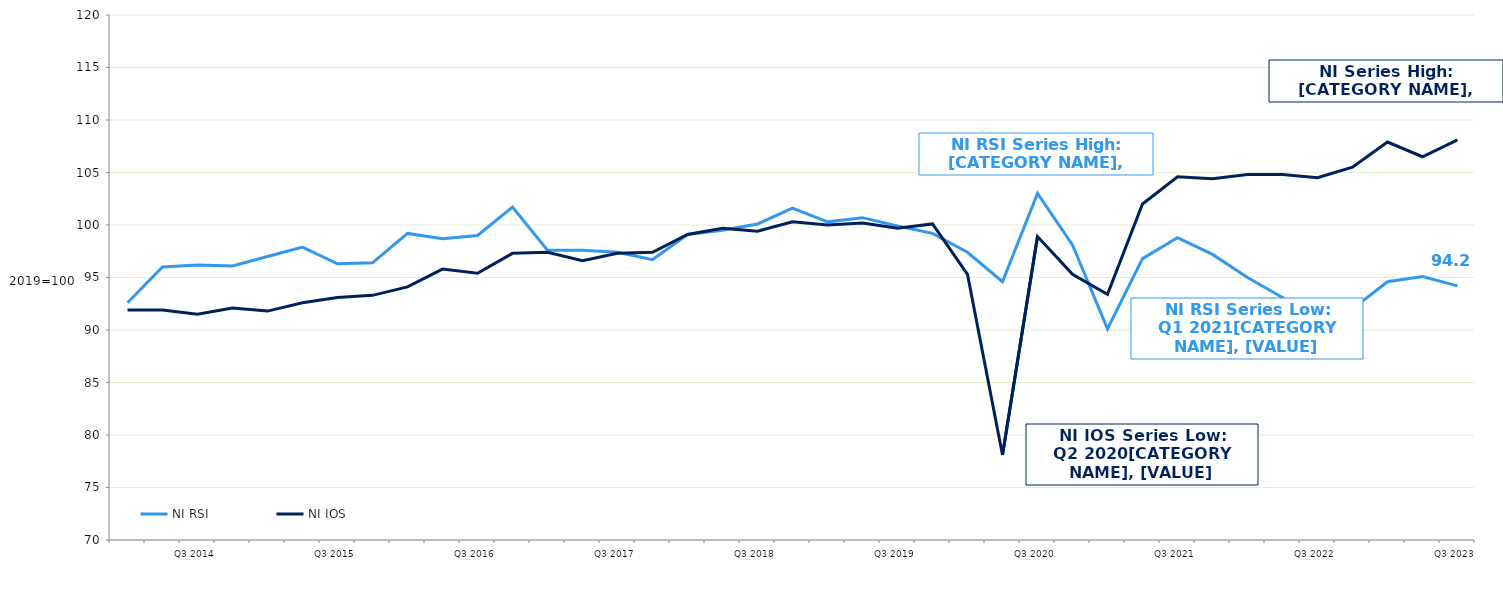
| Category | NI RSI | NI IOS |
|---|---|---|
|  | 92.6 | 91.9 |
|  | 96 | 91.9 |
| Q3 2014 | 96.2 | 91.5 |
|  | 96.1 | 92.1 |
|  | 97 | 91.8 |
|  | 97.9 | 92.6 |
| Q3 2015 | 96.3 | 93.1 |
|  | 96.4 | 93.3 |
|  | 99.2 | 94.1 |
|  | 98.7 | 95.8 |
| Q3 2016 | 99 | 95.4 |
|  | 101.7 | 97.3 |
|  | 97.6 | 97.4 |
|  | 97.6 | 96.6 |
| Q3 2017 | 97.4 | 97.3 |
|  | 96.7 | 97.4 |
|  | 99.1 | 99.1 |
|  | 99.5 | 99.7 |
| Q3 2018 | 100.1 | 99.4 |
|  | 101.6 | 100.3 |
|  | 100.3 | 100 |
|  | 100.7 | 100.2 |
| Q3 2019 | 99.9 | 99.7 |
|  | 99.2 | 100.1 |
|  | 97.4 | 95.3 |
|  | 94.6 | 78.1 |
| Q3 2020 | 103 | 98.9 |
|  | 98.1 | 95.3 |
|  | 90.1 | 93.4 |
|  | 96.8 | 102 |
| Q3 2021 | 98.8 | 104.6 |
|  | 97.2 | 104.4 |
|  | 95 | 104.8 |
|  | 93.1 | 104.8 |
| Q3 2022 | 91 | 104.5 |
|  | 92 | 105.5 |
|  | 94.6 | 107.9 |
|  | 95.1 | 106.5 |
| Q3 2023 | 94.2 | 108.1 |